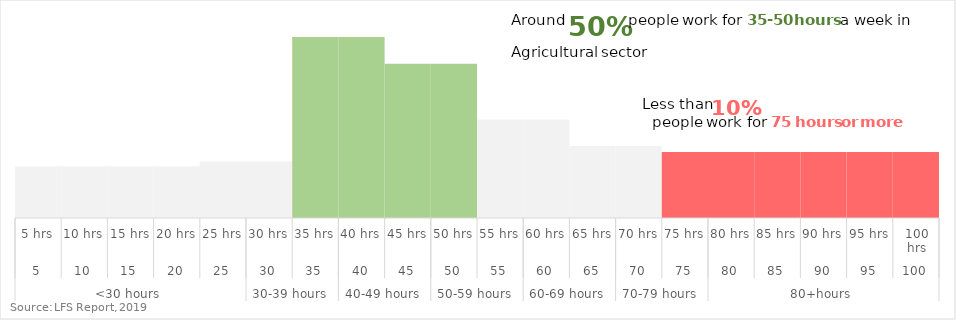
| Category | Series 0 |
|---|---|
| 0 | 7.6 |
| 1 | 7.6 |
| 2 | 7.6 |
| 3 | 7.6 |
| 4 | 8.3 |
| 5 | 8.3 |
| 6 | 26.6 |
| 7 | 26.6 |
| 8 | 22.7 |
| 9 | 22.7 |
| 10 | 14.5 |
| 11 | 14.5 |
| 12 | 10.6 |
| 13 | 10.6 |
| 14 | 9.7 |
| 15 | 9.7 |
| 16 | 9.7 |
| 17 | 9.7 |
| 18 | 9.7 |
| 19 | 9.7 |